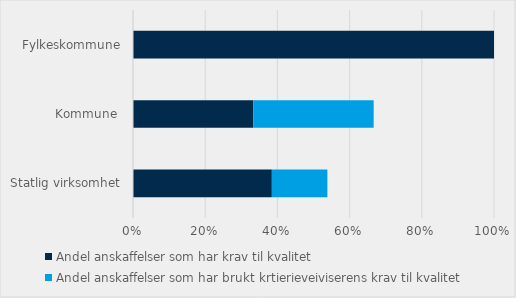
| Category | Andel anskaffelser som har krav til kvalitet | Andel anskaffelser som har brukt krtierieveiviserens krav til kvalitet |
|---|---|---|
| Statlig virksomhet | 0.385 | 0.154 |
| Kommune  | 0.333 | 0.333 |
| Fylkeskommune | 1 | 0 |